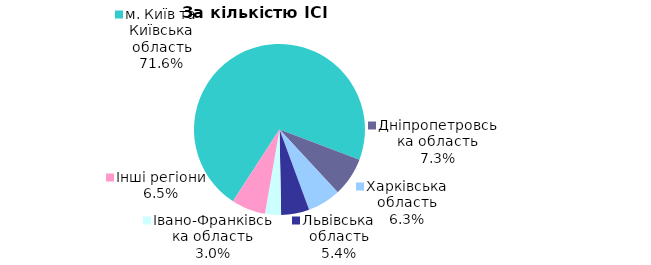
| Category | Series 0 |
|---|---|
| м. Київ та Київська область | 0.716 |
| Дніпропетровська область | 0.073 |
| Харківська область | 0.063 |
| Львівська область | 0.053 |
| Iвано-Франкiвська область | 0.03 |
| Інші регіони | 0.064 |